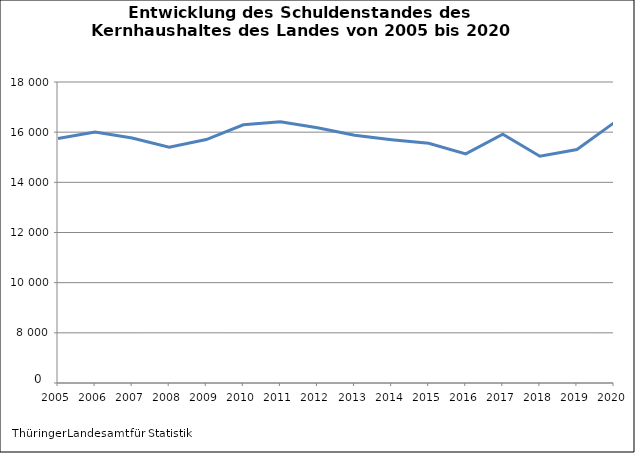
| Category | Series 0 | Series 1 |
|---|---|---|
| 2005 | 0 | 15748208 |
| 2006 | 0 | 16004524 |
| 2007 | 0 | 15766974 |
| 2008 | 0 | 15398540 |
| 2009 | 0 | 15706870 |
| 2010 | 0 | 16295564 |
| 2011 | 0 | 16411400 |
| 2012 | 0 | 16174712 |
| 2013 | 2013 | 15874154 |
| 2014 | 2014 | 15699304 |
| 2015 | 0 | 15555004 |
| 2016 | 2016 | 15133688 |
| 2017 | 0 | 15916908 |
| 2018 | 2018 | 15041750 |
| 2019 | 0 | 15308518 |
| 2020 | 0 | 16374056 |